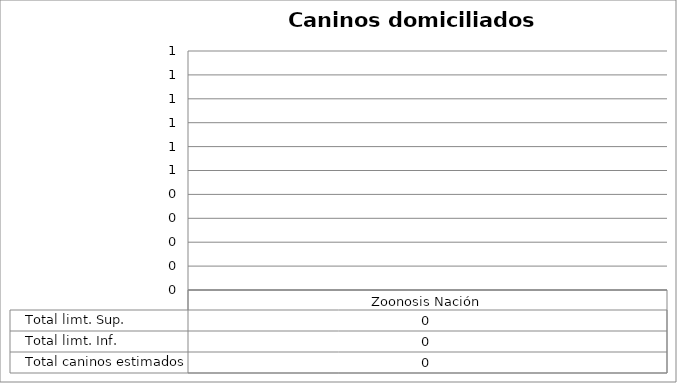
| Category | Total limt. Sup. | Total limt. Inf. | Total caninos estimados |
|---|---|---|---|
| Zoonosis Nación | 0 | 0 | 0 |